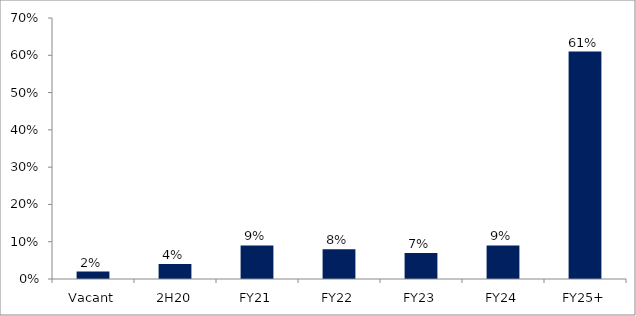
| Category | Series 0 |
|---|---|
| Vacant | 0.02 |
| 2H20 | 0.04 |
| FY21 | 0.09 |
| FY22 | 0.08 |
| FY23 | 0.07 |
| FY24 | 0.09 |
| FY25+ | 0.61 |